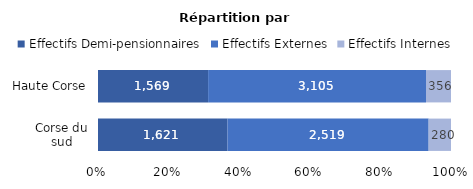
| Category | Effectifs Demi-pensionnaires | Effectifs Externes | Effectifs Internes |
|---|---|---|---|
| Corse du sud | 1621 | 2519 | 280 |
| Haute Corse | 1569 | 3105 | 356 |